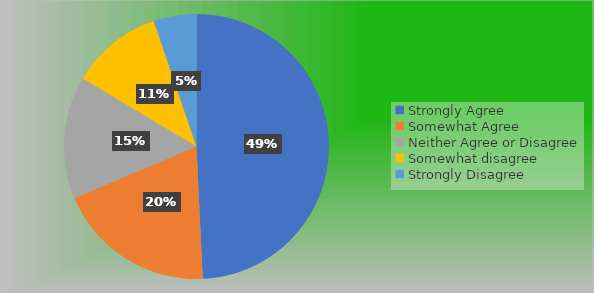
| Category | Series 0 |
|---|---|
| Strongly Agree | 66 |
| Somewhat Agree | 26 |
| Neither Agree or Disagree | 20 |
| Somewhat disagree | 15 |
| Strongly Disagree | 7 |